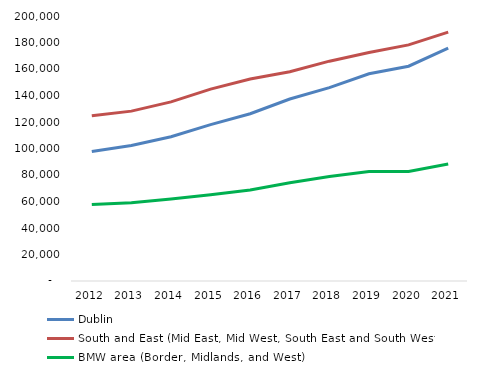
| Category | Dublin | South and East (Mid East, Mid West, South East and South West) | BMW area (Border, Midlands, and West) |
|---|---|---|---|
| 2012.0 | 97718 | 124631 | 57649 |
| 2013.0 | 102250 | 128197 | 59138 |
| 2014.0 | 108891 | 135212 | 61854 |
| 2015.0 | 118031 | 144794 | 65113 |
| 2016.0 | 126257 | 152431 | 68712 |
| 2017.0 | 137378 | 157911 | 74178 |
| 2018.0 | 145899 | 165911 | 78879 |
| 2019.0 | 156380 | 172476 | 82677 |
| 2020.0 | 162108 | 178213 | 82715 |
| 2021.0 | 175830 | 187819 | 88296 |